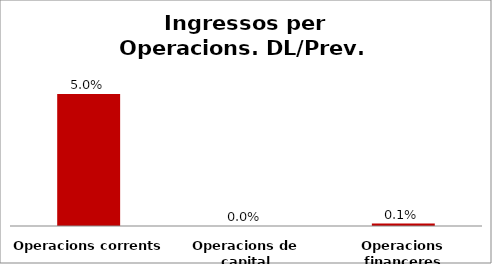
| Category | Series 0 |
|---|---|
| Operacions corrents | 0.05 |
| Operacions de capital | 0 |
| Operacions financeres | 0.001 |